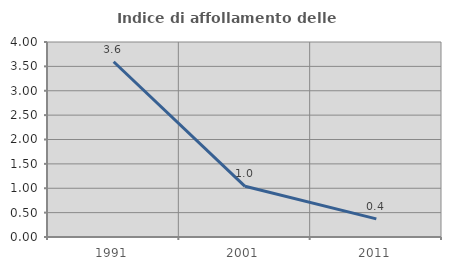
| Category | Indice di affollamento delle abitazioni  |
|---|---|
| 1991.0 | 3.595 |
| 2001.0 | 1.04 |
| 2011.0 | 0.373 |